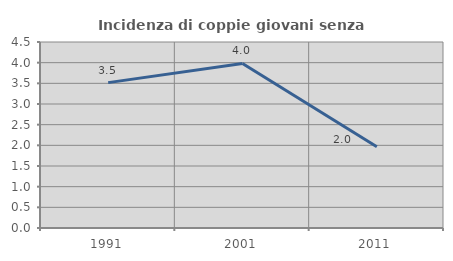
| Category | Incidenza di coppie giovani senza figli |
|---|---|
| 1991.0 | 3.517 |
| 2001.0 | 3.981 |
| 2011.0 | 1.966 |